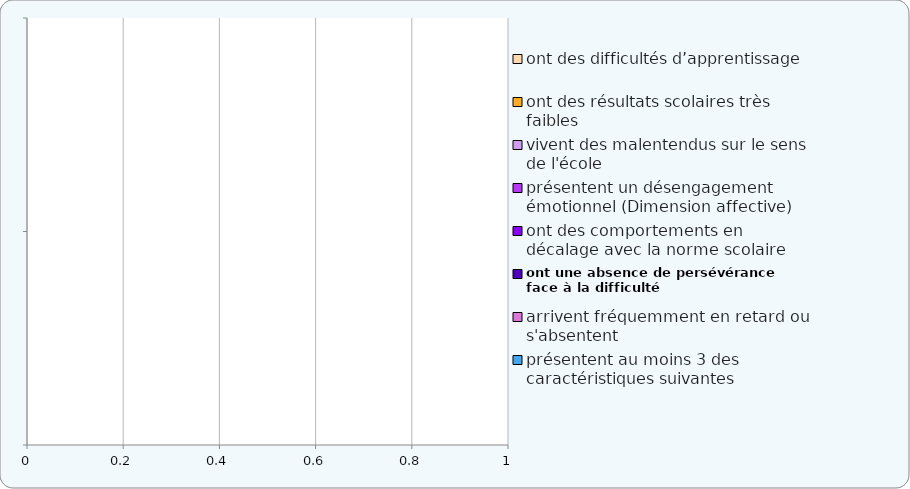
| Category | ont des difficultés d’apprentissage | ont des résultats scolaires très faibles | vivent des malentendus sur le sens de l'école  | présentent un désengagement émotionnel (Dimension affective) | ont des comportements en décalage avec la norme scolaire  | ont une absence de persévérance face à la difficulté | arrivent fréquemment en retard ou s'absentent | présentent au moins 3 des caractéristiques suivantes |
|---|---|---|---|---|---|---|---|---|
|  | 0 | 0 | 0 | 0 | 0 | 0 | 0 | 0 |